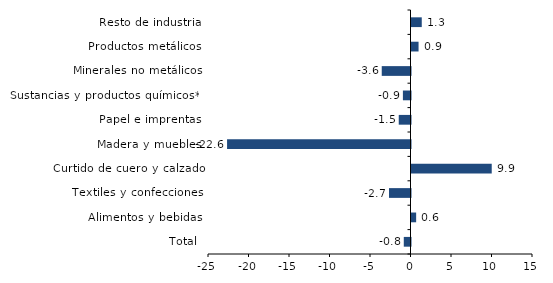
| Category | Series 0 |
|---|---|
| Total | -0.83 |
| Alimentos y bebidas | 0.574 |
| Textiles y confecciones | -2.654 |
| Curtido de cuero y calzado | 9.905 |
| Madera y muebles | -22.646 |
| Papel e imprentas | -1.451 |
| Sustancias y productos químicos** | -0.938 |
| Minerales no metálicos | -3.551 |
| Productos metálicos | 0.871 |
| Resto de industria | 1.267 |